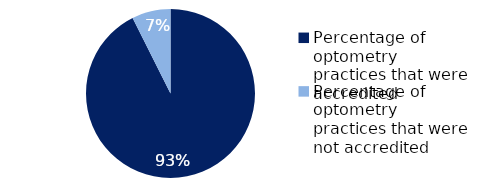
| Category | Series 0 |
|---|---|
| Percentage of optometry practices that were accredited | 0.926 |
| Percentage of optometry practices that were not accredited | 0.074 |